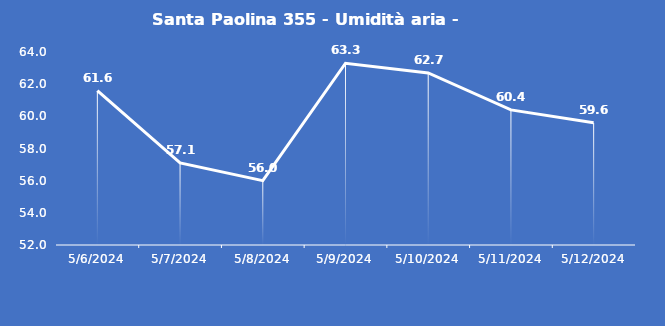
| Category | Santa Paolina 355 - Umidità aria - Grezzo (%) |
|---|---|
| 5/6/24 | 61.6 |
| 5/7/24 | 57.1 |
| 5/8/24 | 56 |
| 5/9/24 | 63.3 |
| 5/10/24 | 62.7 |
| 5/11/24 | 60.4 |
| 5/12/24 | 59.6 |